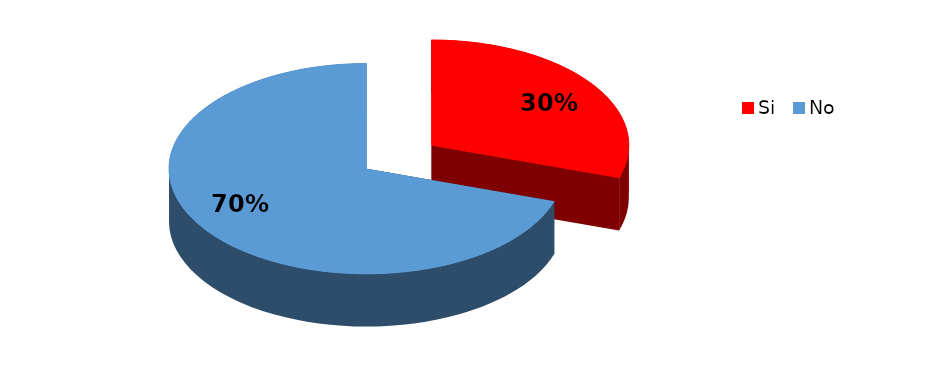
| Category | Frecuencia |
|---|---|
| Si | 3 |
| No | 7 |